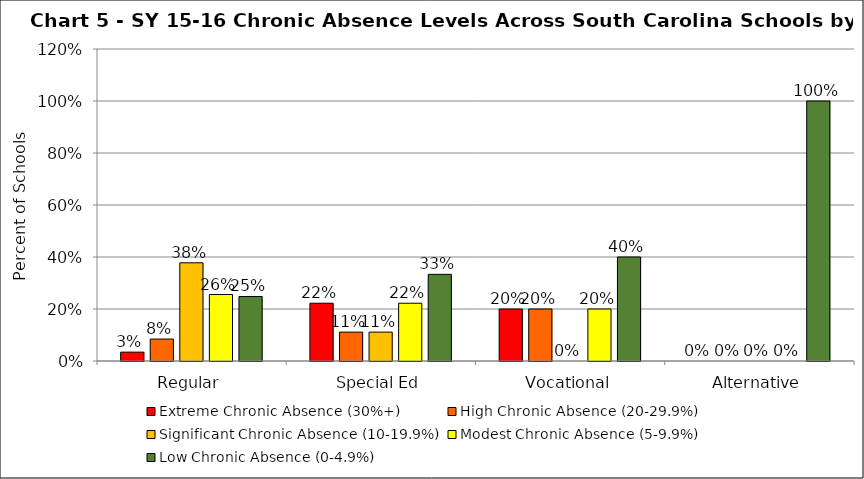
| Category | Extreme Chronic Absence (30%+) | High Chronic Absence (20-29.9%) | Significant Chronic Absence (10-19.9%) | Modest Chronic Absence (5-9.9%) | Low Chronic Absence (0-4.9%) |
|---|---|---|---|---|---|
| 0 | 0.034 | 0.084 | 0.378 | 0.256 | 0.248 |
| 1 | 0.222 | 0.111 | 0.111 | 0.222 | 0.333 |
| 2 | 0.2 | 0.2 | 0 | 0.2 | 0.4 |
| 3 | 0 | 0 | 0 | 0 | 1 |